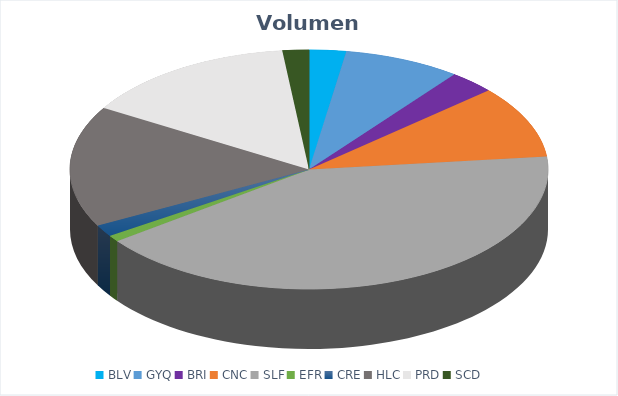
| Category | VOLUMEN ($USD) |
|---|---|
| BLV | 8800 |
| GYQ | 27896.88 |
| BRI | 11000 |
| CNC | 34510 |
| SLF | 146625.92 |
| EFR | 3000.4 |
| CRE | 5591.25 |
| HLC | 57800 |
| PRD | 51661.5 |
| SCD | 6291 |